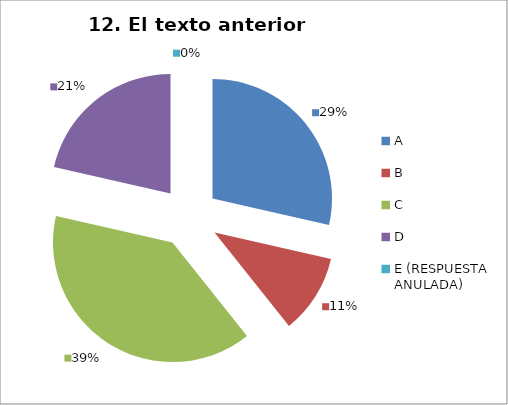
| Category | CANTIDAD DE RESPUESTAS PREGUNTA (12) | PORCENTAJE |
|---|---|---|
| A | 8 | 0.286 |
| B | 3 | 0.107 |
| C | 11 | 0.393 |
| D | 6 | 0.214 |
| E (RESPUESTA ANULADA) | 0 | 0 |